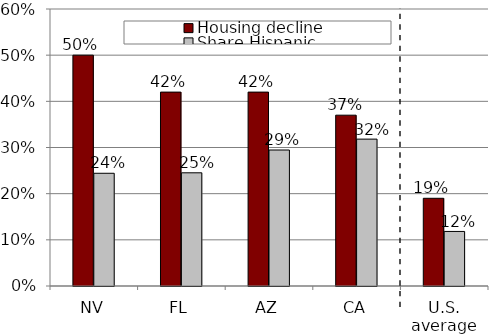
| Category | Housing decline | Share Hispanic |
|---|---|---|
| NV | 0.5 | 0.244 |
| FL | 0.42 | 0.245 |
| AZ | 0.42 | 0.295 |
| CA | 0.37 | 0.318 |
| U.S. average | 0.19 | 0.118 |